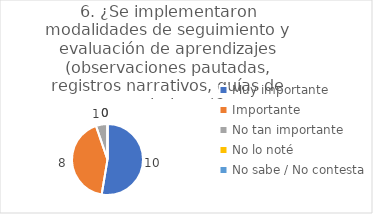
| Category | 6. ¿Se implementaron modalidades de seguimiento y evaluación de aprendizajes (observaciones pautadas, registros narrativos, guías de seguimiento)? |
|---|---|
| Muy importante  | 0.526 |
| Importante  | 0.421 |
| No tan importante  | 0.053 |
| No lo noté  | 0 |
| No sabe / No contesta | 0 |